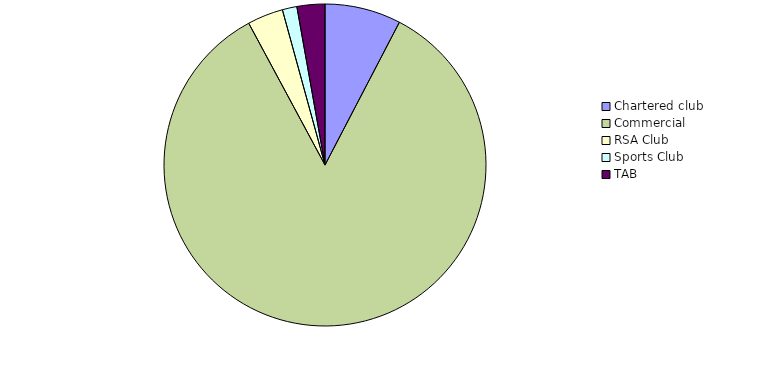
| Category | Series 0 |
|---|---|
| Chartered club | 14717285.48 |
| Commercial | 162608109.57 |
| RSA Club  | 6912917.93 |
| Sports Club | 2817960.77 |
| TAB | 5390519.75 |